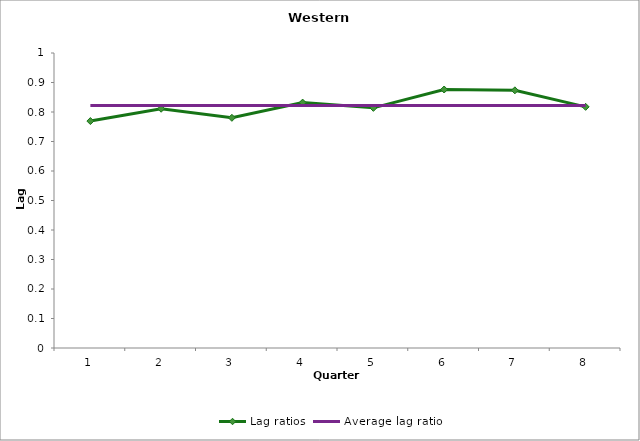
| Category | Lag ratios | Average lag ratio |
|---|---|---|
| 0 | 0.769 | 0.822 |
| 1 | 0.811 | 0.822 |
| 2 | 0.78 | 0.822 |
| 3 | 0.832 | 0.822 |
| 4 | 0.814 | 0.822 |
| 5 | 0.876 | 0.822 |
| 6 | 0.873 | 0.822 |
| 7 | 0.817 | 0.822 |